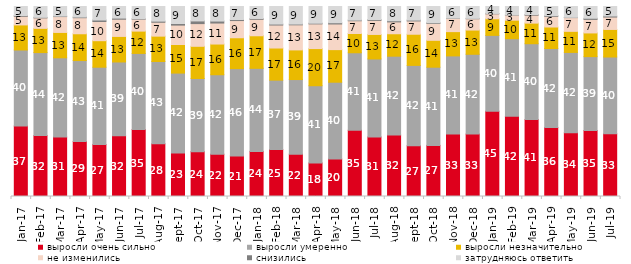
| Category | выросли очень сильно | выросли умеренно | выросли незначительно | не изменились | снизились | затрудняюсь ответить |
|---|---|---|---|---|---|---|
| 2017-01-01 | 37.15 | 39.95 | 13.2 | 4.55 | 0.4 | 4.75 |
| 2017-02-01 | 32.05 | 43.7 | 12.75 | 5.5 | 0.3 | 5.7 |
| 2017-03-01 | 31.3 | 41.7 | 13.35 | 8.35 | 0.25 | 5.05 |
| 2017-04-01 | 28.95 | 42.6 | 14.1 | 8.45 | 0.35 | 5.55 |
| 2017-05-01 | 27.4 | 40.65 | 13.95 | 10.1 | 0.8 | 7.1 |
| 2017-06-01 | 31.95 | 38.85 | 13.45 | 9.05 | 0.6 | 6.1 |
| 2017-07-01 | 35.25 | 40.05 | 11.75 | 6.25 | 0.25 | 6.45 |
| 2017-08-01 | 27.7 | 43.35 | 13.35 | 7.3 | 0.6 | 7.7 |
| 2017-09-01 | 22.95 | 42 | 15.05 | 10.2 | 0.85 | 8.95 |
| 2017-10-01 | 23.6 | 38.5 | 16.95 | 11.95 | 1.4 | 7.6 |
| 2017-11-01 | 22.25 | 41.8 | 16.15 | 11.05 | 1.05 | 7.65 |
| 2017-12-01 | 21.35 | 45.95 | 16.25 | 9.05 | 0.55 | 6.85 |
| 2018-01-01 | 23.75 | 43.7 | 17.15 | 8.65 | 0.45 | 6.3 |
| 2018-02-01 | 24.7 | 36.55 | 16.9 | 12.1 | 0.5 | 9.25 |
| 2018-03-01 | 22.25 | 39.3 | 15.6 | 13.2 | 0.4 | 9.25 |
| 2018-04-01 | 17.65 | 40.65 | 19.55 | 13 | 0.35 | 8.8 |
| 2018-05-01 | 19.75 | 40.4 | 17.15 | 13.5 | 0.65 | 8.55 |
| 2018-06-01 | 34.85 | 40.8 | 10.15 | 6.7 | 0.35 | 7.15 |
| 2018-07-01 | 31.3 | 41.05 | 12.9 | 7.4 | 0.45 | 6.85 |
| 2018-08-01 | 32.35 | 41.5 | 11.8 | 6.25 | 0.6 | 7.5 |
| 2018-09-01 | 26.7 | 42.3 | 16.4 | 7 | 0.45 | 7.15 |
| 2018-10-01 | 26.9 | 41.15 | 14.15 | 8.9 | 0.35 | 8.55 |
| 2018-11-01 | 32.934 | 41.068 | 12.774 | 7.036 | 0.1 | 6.088 |
| 2018-12-01 | 32.85 | 42 | 12.75 | 5.95 | 0.2 | 6.25 |
| 2019-01-01 | 44.85 | 39.95 | 8.75 | 2.6 | 0.2 | 3.65 |
| 2019-02-01 | 42.2 | 40.85 | 9.75 | 2.7 | 0.1 | 4.4 |
| 2019-03-01 | 40.527 | 39.881 | 10.84 | 4.177 | 0.348 | 4.227 |
| 2019-04-01 | 36.337 | 41.535 | 11.337 | 5.594 | 0.396 | 4.802 |
| 2019-05-01 | 33.531 | 42.298 | 11.095 | 7.231 | 0.149 | 5.696 |
| 2019-06-01 | 34.763 | 38.853 | 12.469 | 7.132 | 0.599 | 6.185 |
| 2019-07-01 | 32.97 | 40.446 | 14.505 | 6.535 | 0.545 | 5 |